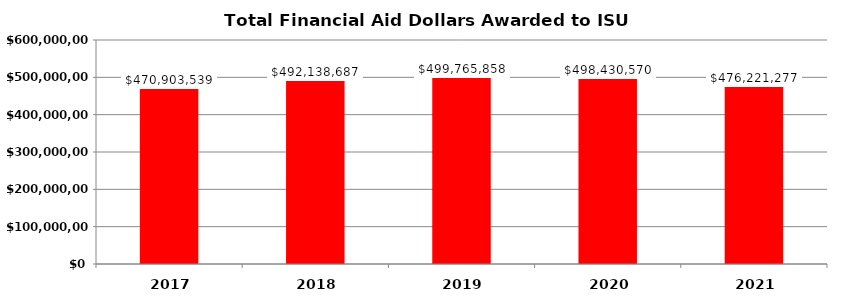
| Category | Total Amount Awarded |
|---|---|
| 2017.0 | 470903539 |
| 2018.0 | 492138687 |
| 2019.0 | 499765858 |
| 2020.0 | 498430570 |
| 2021.0 | 476221277 |